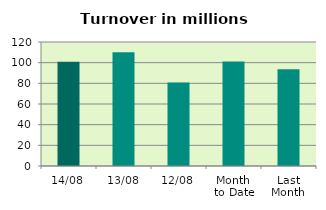
| Category | Series 0 |
|---|---|
| 14/08 | 101.002 |
| 13/08 | 110.163 |
| 12/08 | 80.893 |
| Month 
to Date | 101.063 |
| Last
Month | 93.691 |